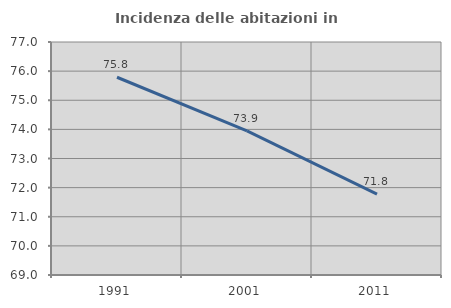
| Category | Incidenza delle abitazioni in proprietà  |
|---|---|
| 1991.0 | 75.789 |
| 2001.0 | 73.95 |
| 2011.0 | 71.777 |